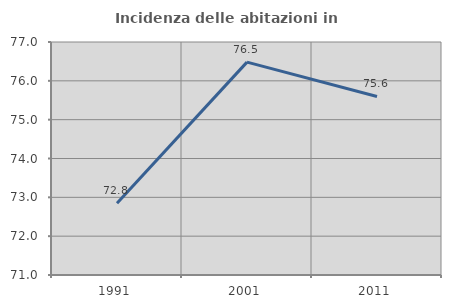
| Category | Incidenza delle abitazioni in proprietà  |
|---|---|
| 1991.0 | 72.847 |
| 2001.0 | 76.482 |
| 2011.0 | 75.597 |